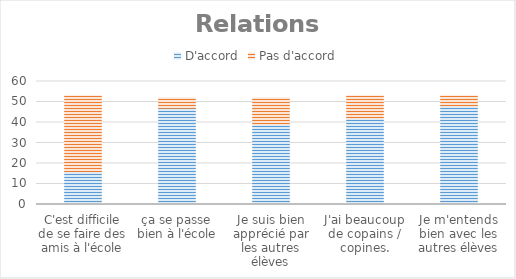
| Category | D'accord | Pas d'accord |
|---|---|---|
| C'est difficile de se faire des amis à l'école | 16 | 37 |
| ça se passe bien à l'école | 47 | 5 |
| Je suis bien apprécié par les autres élèves | 39 | 13 |
| J'ai beaucoup de copains / copines. | 42 | 11 |
| Je m'entends bien avec les autres élèves | 48 | 5 |